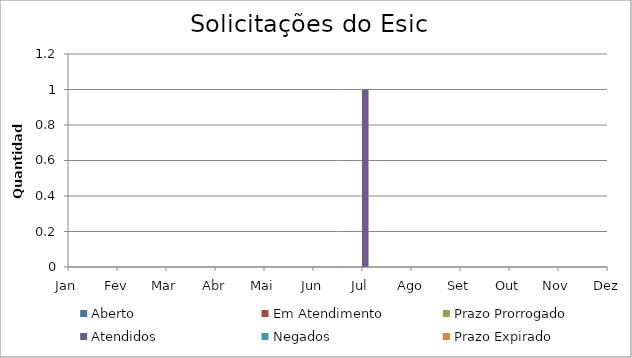
| Category | Aberto | Em Atendimento | Prazo Prorrogado | Atendidos | Negados | Prazo Expirado |
|---|---|---|---|---|---|---|
| Jan | 0 | 0 | 0 | 0 | 0 | 0 |
| Fev | 0 | 0 | 0 | 0 | 0 | 0 |
| Mar | 0 | 0 | 0 | 0 | 0 | 0 |
| Abr | 0 | 0 | 0 | 0 | 0 | 0 |
| Mai | 0 | 0 | 0 | 0 | 0 | 0 |
| Jun | 0 | 0 | 0 | 0 | 0 | 0 |
| Jul | 0 | 0 | 0 | 1 | 0 | 0 |
| Ago | 0 | 0 | 0 | 0 | 0 | 0 |
| Set | 0 | 0 | 0 | 0 | 0 | 0 |
| Out | 0 | 0 | 0 | 0 | 0 | 0 |
| Nov | 0 | 0 | 0 | 0 | 0 | 0 |
| Dez | 0 | 0 | 0 | 1 | 0 | 0 |